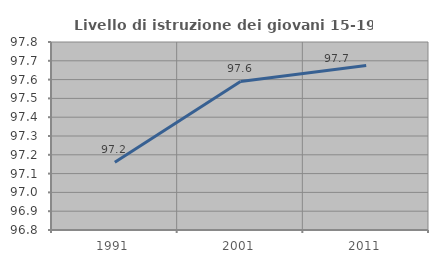
| Category | Livello di istruzione dei giovani 15-19 anni |
|---|---|
| 1991.0 | 97.161 |
| 2001.0 | 97.59 |
| 2011.0 | 97.674 |